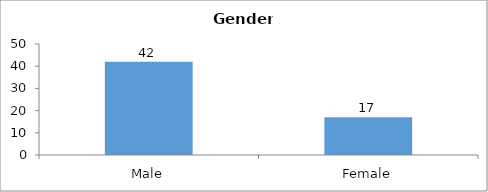
| Category | Gender |
|---|---|
| Male | 42 |
| Female | 17 |